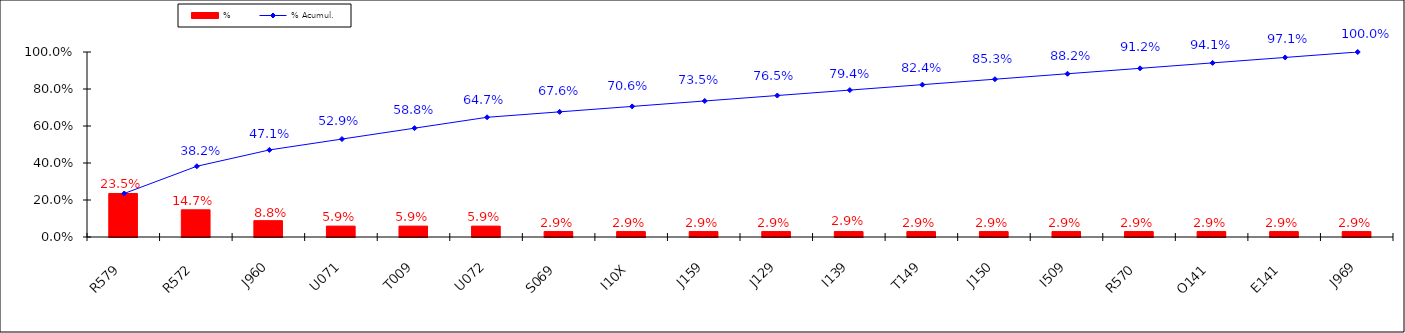
| Category | % |
|---|---|
| R579 | 0.235 |
| R572 | 0.147 |
| J960 | 0.088 |
| U071 | 0.059 |
| T009 | 0.059 |
| U072 | 0.059 |
| S069 | 0.029 |
| I10X | 0.029 |
| J159 | 0.029 |
| J129 | 0.029 |
| I139 | 0.029 |
| T149 | 0.029 |
| J150 | 0.029 |
| I509 | 0.029 |
| R570 | 0.029 |
| O141 | 0.029 |
| E141 | 0.029 |
| J969 | 0.029 |